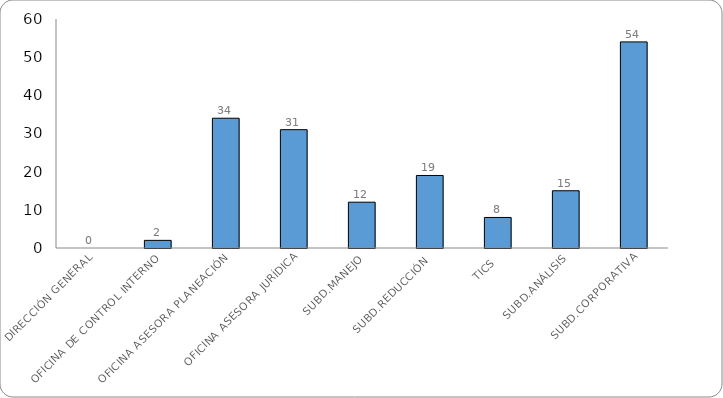
| Category | HALLAZGOS TOTALES |
|---|---|
| DIRECCIÓN GENERAL | 0 |
| OFICINA DE CONTROL INTERNO | 2 |
| OFICINA ASESORA PLANEACIÓN | 34 |
| OFICINA ASESORA JURÍDICA | 31 |
| SUBD.MANEJO | 12 |
| SUBD.REDUCCIÓN | 19 |
| TICS | 8 |
| SUBD.ANÁLISIS | 15 |
| SUBD.CORPORATIVA | 54 |